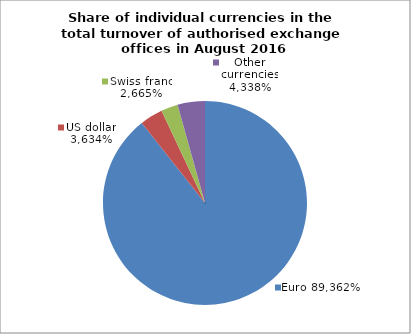
| Category | EUR |
|---|---|
| 0 | 0.894 |
| 1 | 0.036 |
| 2 | 0.027 |
| 3 | 0.043 |